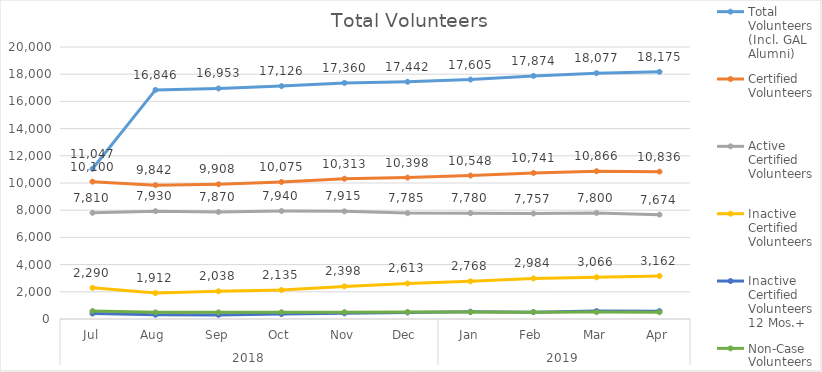
| Category | Total Volunteers (Incl. GAL Alumni)  | Certified Volunteers  | Active Certified Volunteers  | Inactive Certified Volunteers  | Inactive Certified Volunteers 12 Mos.+  | Non-Case Volunteers  |
|---|---|---|---|---|---|---|
| 0 | 11047 | 10100 | 7810 | 2290 | 400 | 583 |
| 1 | 16846 | 9842 | 7930 | 1912 | 315 | 488 |
| 2 | 16953 | 9908 | 7870 | 2038 | 302 | 488 |
| 3 | 17126 | 10075 | 7940 | 2135 | 362 | 501 |
| 4 | 17360 | 10313 | 7915 | 2398 | 416 | 505 |
| 5 | 17442 | 10398 | 7785 | 2613 | 482 | 506 |
| 6 | 17605 | 10548 | 7780 | 2768 | 540 | 506 |
| 7 | 17874 | 10741 | 7757 | 2984 | 505 | 505 |
| 8 | 18077 | 10866 | 7800 | 3066 | 583 | 506 |
| 9 | 18175 | 10836 | 7674 | 3162 | 578 | 497 |